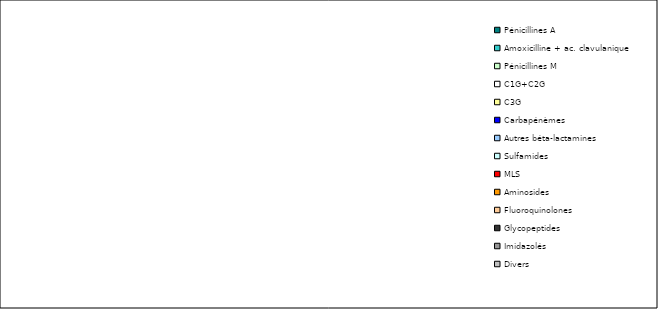
| Category | Series 0 |
|---|---|
| Pénicillines A | 0 |
| Amoxicilline + ac. clavulanique | 0 |
| Pénicillines M | 0 |
| C1G+C2G | 0 |
| C3G | 0 |
| Carbapénèmes | 0 |
| Autres béta-lactamines | 0 |
| Sulfamides | 0 |
| MLS | 0 |
| Aminosides | 0 |
| Fluoroquinolones | 0 |
| Glycopeptides | 0 |
| Imidazolés | 0 |
| Divers | 0 |